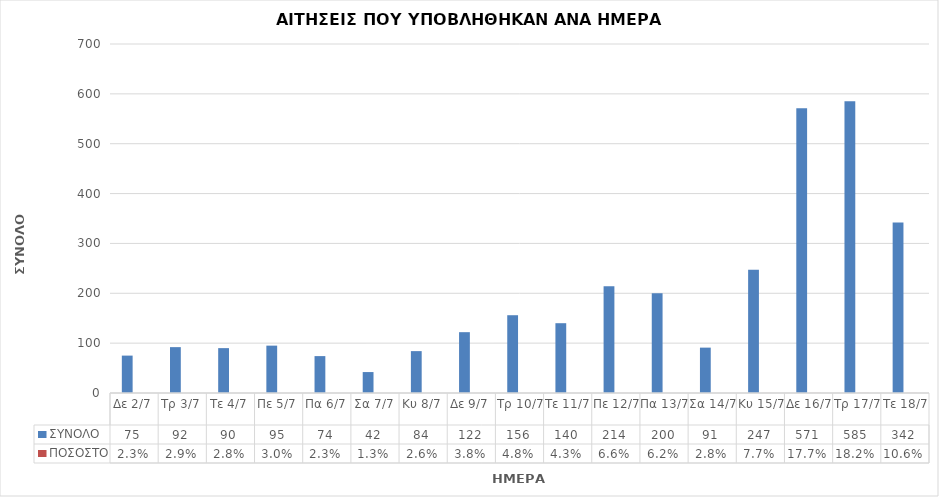
| Category | ΣΥΝΟΛΟ | ΠΟΣΟΣΤΟ |
|---|---|---|
| Δε 2/7 | 75 | 0.023 |
| Τρ 3/7 | 92 | 0.029 |
| Τε 4/7 | 90 | 0.028 |
| Πε 5/7 | 95 | 0.03 |
| Πα 6/7 | 74 | 0.023 |
| Σα 7/7 | 42 | 0.013 |
| Κυ 8/7 | 84 | 0.026 |
| Δε 9/7 | 122 | 0.038 |
| Τρ 10/7 | 156 | 0.048 |
| Τε 11/7 | 140 | 0.043 |
| Πε 12/7 | 214 | 0.066 |
| Πα 13/7 | 200 | 0.062 |
| Σα 14/7 | 91 | 0.028 |
| Κυ 15/7 | 247 | 0.077 |
| Δε 16/7 | 571 | 0.177 |
| Τρ 17/7 | 585 | 0.182 |
| Τε 18/7 | 342 | 0.106 |